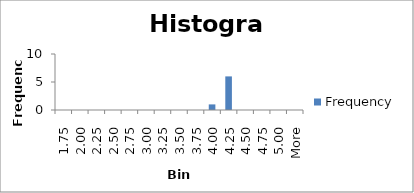
| Category | Frequency |
|---|---|
| 1.75 | 0 |
| 2.00 | 0 |
| 2.25 | 0 |
| 2.50 | 0 |
| 2.75 | 0 |
| 3.00 | 0 |
| 3.25 | 0 |
| 3.50 | 0 |
| 3.75 | 0 |
| 4.00 | 1 |
| 4.25 | 6 |
| 4.50 | 0 |
| 4.75 | 0 |
| 5.00 | 0 |
| More | 0 |